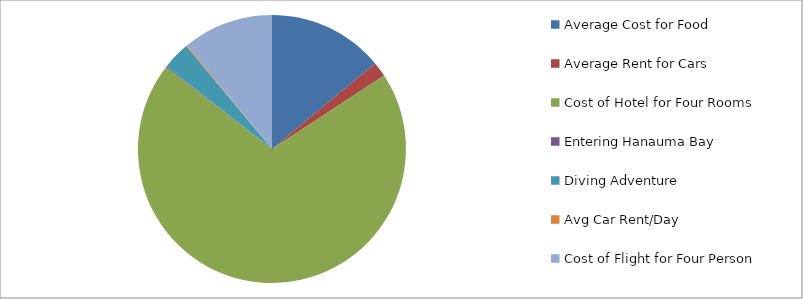
| Category | Series 0 |
|---|---|
| Average Cost for Food | 3920 |
| Average Rent for Cars | 504 |
| Cost of Hotel for Four Rooms | 19555.2 |
| Entering Hanauma Bay | 31.4 |
| Diving Adventure | 935.2 |
| Avg Car Rent/Day | 40 |
| Cost of Flight for Four Person | 3063.2 |